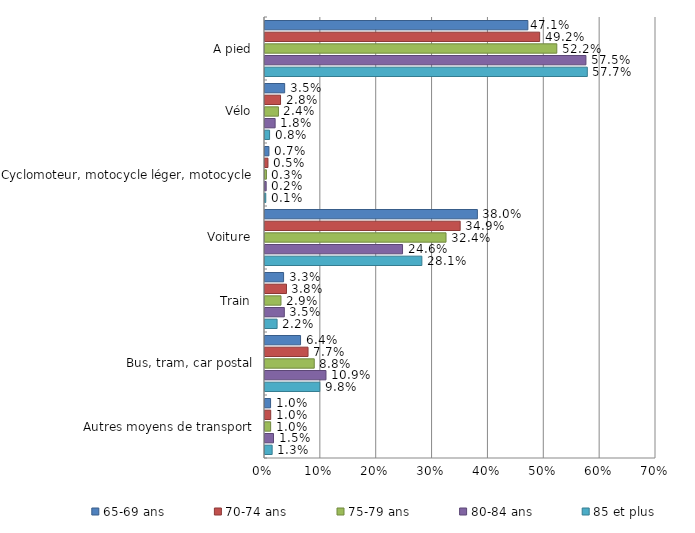
| Category | 65-69 ans | 70-74 ans | 75-79 ans | 80-84 ans | 85 et plus |
|---|---|---|---|---|---|
| A pied | 47.062 | 49.174 | 52.241 | 57.456 | 57.706 |
| Vélo | 3.52 | 2.781 | 2.406 | 1.814 | 0.818 |
| Cyclomoteur, motocycle léger, motocycle | 0.705 | 0.529 | 0.256 | 0.209 | 0.138 |
| Voiture | 38.023 | 34.939 | 32.408 | 24.624 | 28.085 |
| Train | 3.328 | 3.849 | 2.859 | 3.459 | 2.164 |
| Bus, tram, car postal | 6.365 | 7.705 | 8.819 | 10.915 | 9.809 |
| Autres moyens de transport | 0.998 | 1.024 | 1.01 | 1.522 | 1.281 |